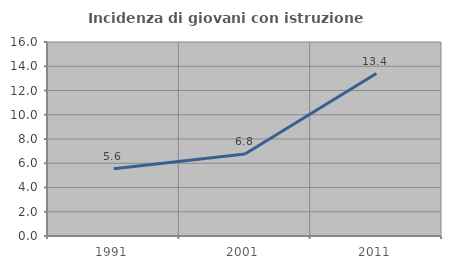
| Category | Incidenza di giovani con istruzione universitaria |
|---|---|
| 1991.0 | 5.556 |
| 2001.0 | 6.765 |
| 2011.0 | 13.402 |